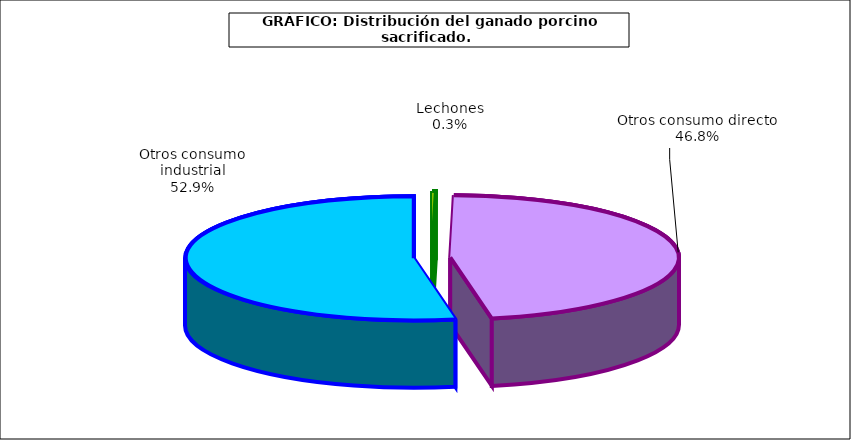
| Category | Series 0 |
|---|---|
| 0 | 13252.205 |
| 1 | 2426053.152 |
| 2 | 2740752.99 |